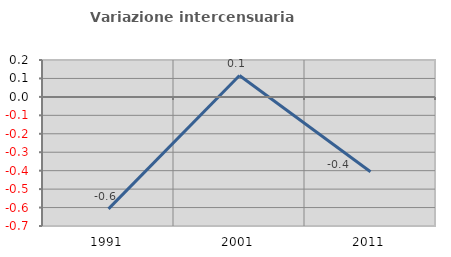
| Category | Variazione intercensuaria annua |
|---|---|
| 1991.0 | -0.607 |
| 2001.0 | 0.116 |
| 2011.0 | -0.406 |